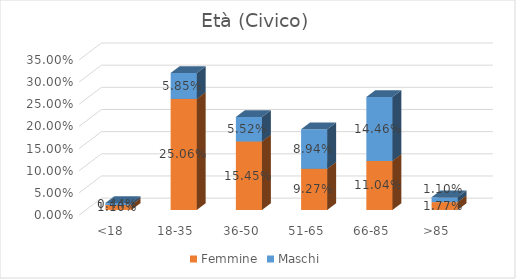
| Category | Femmine | Maschi |
|---|---|---|
| <18 | 0.011 | 0.004 |
| 18-35 | 0.251 | 0.058 |
| 36-50 | 0.155 | 0.055 |
| 51-65 | 0.093 | 0.089 |
| 66-85 | 0.11 | 0.145 |
| >85 | 0.018 | 0.011 |